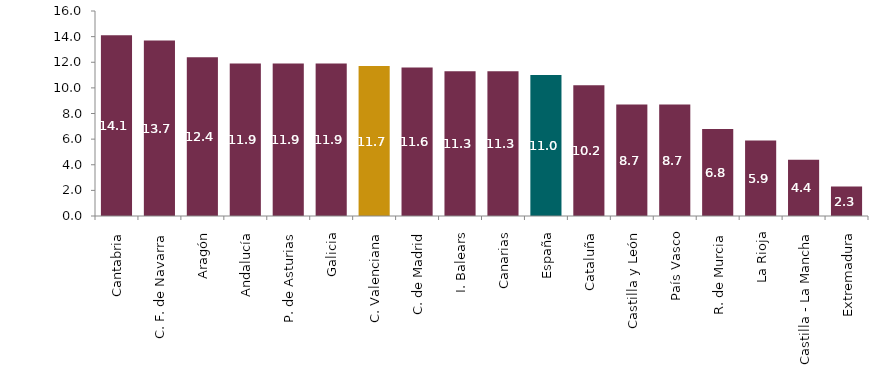
| Category | Vivienda Nueva |
|---|---|
| Cantabria | 14.1 |
| C. F. de Navarra | 13.7 |
| Aragón | 12.4 |
| Andalucía | 11.9 |
| P. de Asturias | 11.9 |
| Galicia | 11.9 |
| C. Valenciana | 11.7 |
| C. de Madrid | 11.6 |
| I. Balears | 11.3 |
| Canarias | 11.3 |
| España | 11 |
| Cataluña | 10.2 |
| Castilla y León | 8.7 |
| País Vasco | 8.7 |
| R. de Murcia | 6.8 |
| La Rioja | 5.9 |
| Castilla - La Mancha | 4.4 |
| Extremadura | 2.3 |